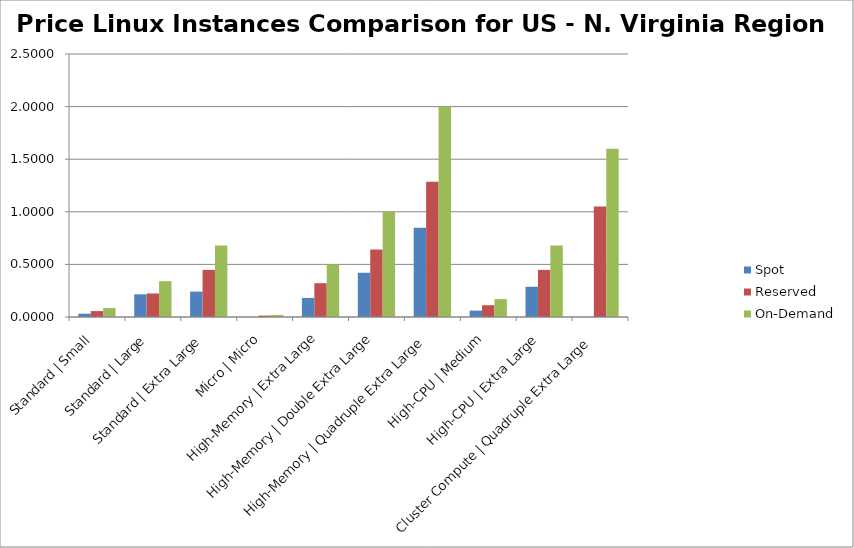
| Category | Spot | Reserved | On-Demand |
|---|---|---|---|
| Standard | Small | 0.031 | 0.056 | 0.085 |
| Standard | Large | 0.216 | 0.224 | 0.34 |
| Standard | Extra Large | 0.241 | 0.448 | 0.68 |
| Micro | Micro | 0 | 0.013 | 0.02 |
| High-Memory | Extra Large | 0.181 | 0.321 | 0.5 |
| High-Memory | Double Extra Large | 0.42 | 0.643 | 1 |
| High-Memory | Quadruple Extra Large | 0.848 | 1.285 | 2 |
| High-CPU | Medium | 0.061 | 0.112 | 0.17 |
| High-CPU | Extra Large | 0.288 | 0.448 | 0.68 |
| Cluster Compute | Quadruple Extra Large | 0 | 1.05 | 1.6 |